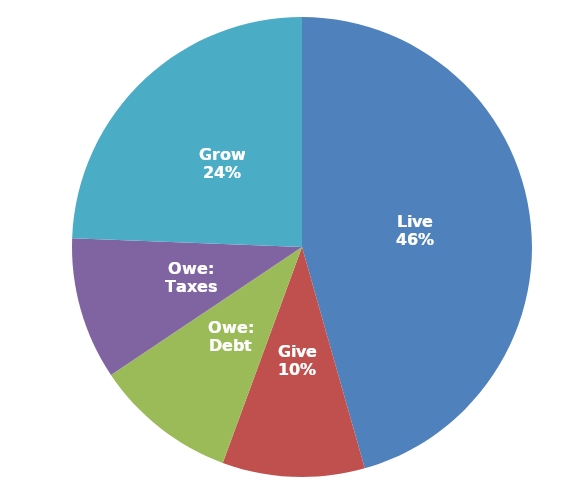
| Category | Series 0 |
|---|---|
| Live | 0.456 |
| Give | 0.1 |
| Owe: Debt | 0.1 |
| Owe: Taxes | 0.1 |
| Grow | 0.244 |